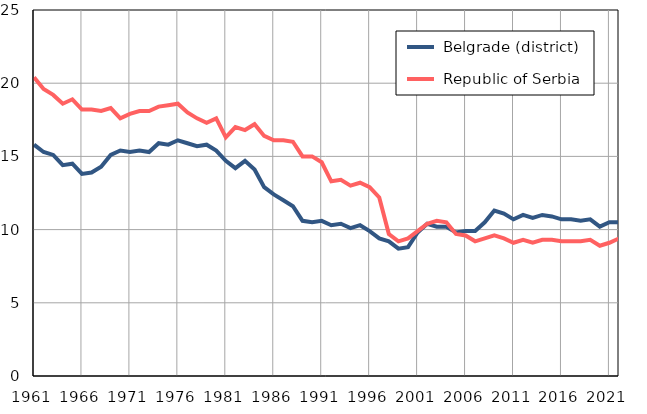
| Category |  Belgrade (district) |  Republic of Serbia |
|---|---|---|
| 1961.0 | 15.8 | 20.4 |
| 1962.0 | 15.3 | 19.6 |
| 1963.0 | 15.1 | 19.2 |
| 1964.0 | 14.4 | 18.6 |
| 1965.0 | 14.5 | 18.9 |
| 1966.0 | 13.8 | 18.2 |
| 1967.0 | 13.9 | 18.2 |
| 1968.0 | 14.3 | 18.1 |
| 1969.0 | 15.1 | 18.3 |
| 1970.0 | 15.4 | 17.6 |
| 1971.0 | 15.3 | 17.9 |
| 1972.0 | 15.4 | 18.1 |
| 1973.0 | 15.3 | 18.1 |
| 1974.0 | 15.9 | 18.4 |
| 1975.0 | 15.8 | 18.5 |
| 1976.0 | 16.1 | 18.6 |
| 1977.0 | 15.9 | 18 |
| 1978.0 | 15.7 | 17.6 |
| 1979.0 | 15.8 | 17.3 |
| 1980.0 | 15.4 | 17.6 |
| 1981.0 | 14.7 | 16.3 |
| 1982.0 | 14.2 | 17 |
| 1983.0 | 14.7 | 16.8 |
| 1984.0 | 14.1 | 17.2 |
| 1985.0 | 12.9 | 16.4 |
| 1986.0 | 12.4 | 16.1 |
| 1987.0 | 12 | 16.1 |
| 1988.0 | 11.6 | 16 |
| 1989.0 | 10.6 | 15 |
| 1990.0 | 10.5 | 15 |
| 1991.0 | 10.6 | 14.6 |
| 1992.0 | 10.3 | 13.3 |
| 1993.0 | 10.4 | 13.4 |
| 1994.0 | 10.1 | 13 |
| 1995.0 | 10.3 | 13.2 |
| 1996.0 | 9.9 | 12.9 |
| 1997.0 | 9.4 | 12.2 |
| 1998.0 | 9.2 | 9.7 |
| 1999.0 | 8.7 | 9.2 |
| 2000.0 | 8.8 | 9.4 |
| 2001.0 | 9.8 | 9.9 |
| 2002.0 | 10.4 | 10.4 |
| 2003.0 | 10.2 | 10.6 |
| 2004.0 | 10.2 | 10.5 |
| 2005.0 | 9.8 | 9.7 |
| 2006.0 | 9.9 | 9.6 |
| 2007.0 | 9.9 | 9.2 |
| 2008.0 | 10.5 | 9.4 |
| 2009.0 | 11.3 | 9.6 |
| 2010.0 | 11.1 | 9.4 |
| 2011.0 | 10.7 | 9.1 |
| 2012.0 | 11 | 9.3 |
| 2013.0 | 10.8 | 9.1 |
| 2014.0 | 11 | 9.3 |
| 2015.0 | 10.9 | 9.3 |
| 2016.0 | 10.7 | 9.2 |
| 2017.0 | 10.7 | 9.2 |
| 2018.0 | 10.6 | 9.2 |
| 2019.0 | 10.7 | 9.3 |
| 2020.0 | 10.2 | 8.9 |
| 2021.0 | 10.5 | 9.1 |
| 2022.0 | 10.5 | 9.4 |